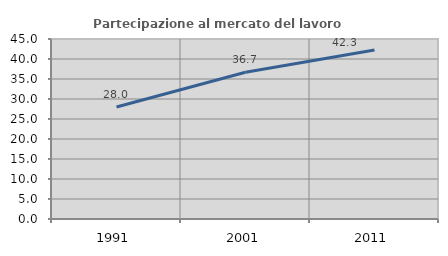
| Category | Partecipazione al mercato del lavoro  femminile |
|---|---|
| 1991.0 | 28.016 |
| 2001.0 | 36.694 |
| 2011.0 | 42.271 |